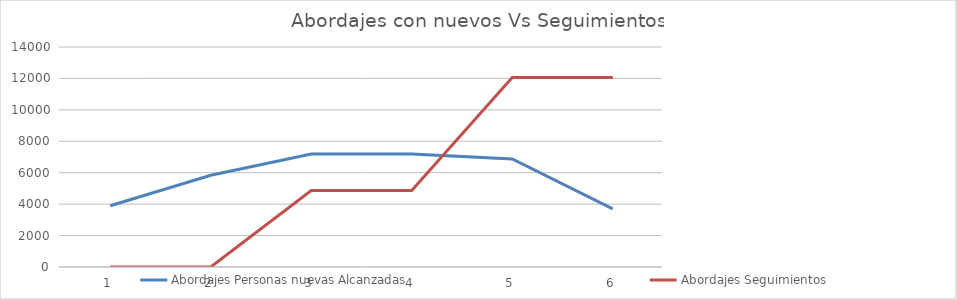
| Category | Abordajes Personas nuevas Alcanzadas | Abordajes Seguimientos |
|---|---|---|
| 0 | 3894.36 | 0 |
| 1 | 5841.54 | 0 |
| 2 | 7196.1 | 4867.95 |
| 3 | 7196.1 | 4867.95 |
| 4 | 6878.625 | 12064.05 |
| 5 | 3703.875 | 12064.05 |